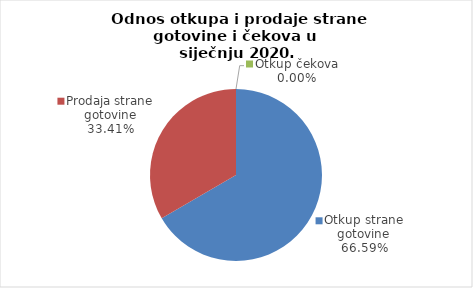
| Category | Series 0 |
|---|---|
| Otkup strane gotovine | 66.589 |
| Prodaja strane gotovine | 33.411 |
| Otkup čekova | 0 |